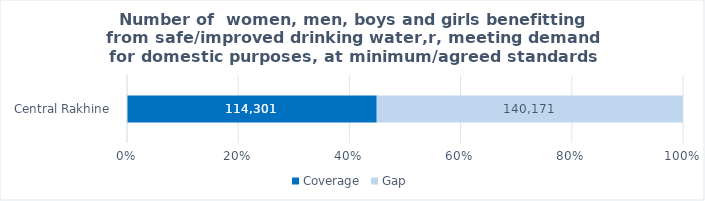
| Category | Coverage |  Gap  |
|---|---|---|
|  Central Rakhine  | 114301.493 | 140170.507 |